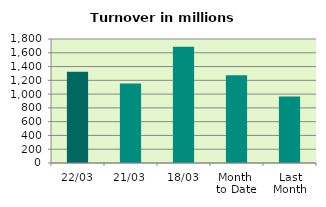
| Category | Series 0 |
|---|---|
| 22/03 | 1324.706 |
| 21/03 | 1154.967 |
| 18/03 | 1687.145 |
| Month 
to Date | 1275.269 |
| Last
Month | 966.674 |